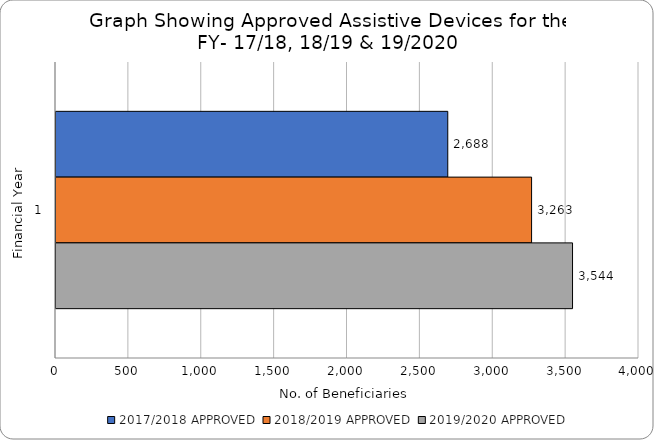
| Category | 2017/2018 APPROVED | 2018/2019 APPROVED | 2019/2020 APPROVED |
|---|---|---|---|
| 0 | 2688 | 3263 | 3544 |